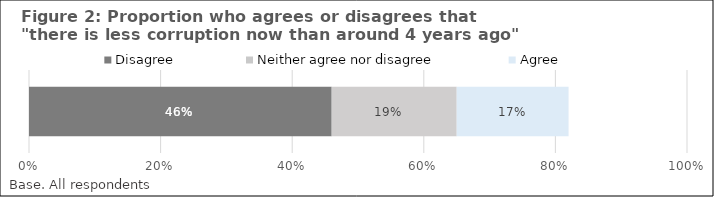
| Category | Disagree | Neither agree nor disagree | Agree |
|---|---|---|---|
| 0 | 0.46 | 0.19 | 0.17 |